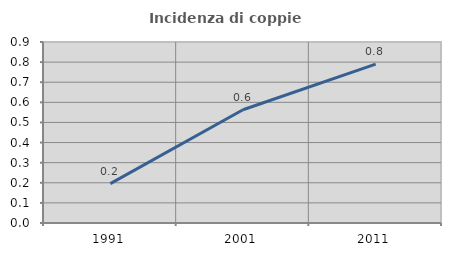
| Category | Incidenza di coppie miste |
|---|---|
| 1991.0 | 0.196 |
| 2001.0 | 0.563 |
| 2011.0 | 0.79 |